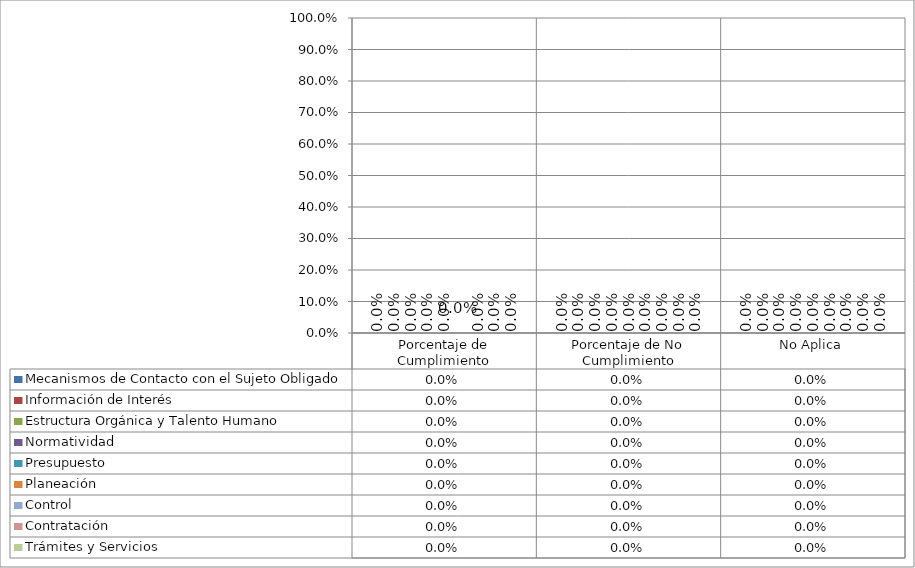
| Category | Mecanismos de Contacto con el Sujeto Obligado | Información de Interés  | Estructura Orgánica y Talento Humano | Normatividad | Presupuesto | Planeación | Control | Contratación | Trámites y Servicios |
|---|---|---|---|---|---|---|---|---|---|
| Porcentaje de Cumplimiento | 0 | 0 | 0 | 0 | 0 | 0 | 0 | 0 | 0 |
| Porcentaje de No Cumplimiento | 0 | 0 | 0 | 0 | 0 | 0 | 0 | 0 | 0 |
| No Aplica | 0 | 0 | 0 | 0 | 0 | 0 | 0 | 0 | 0 |